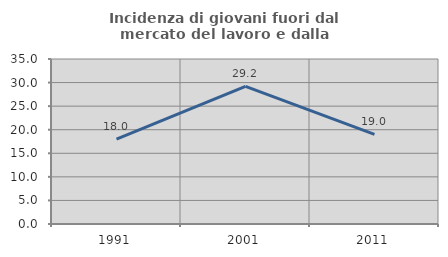
| Category | Incidenza di giovani fuori dal mercato del lavoro e dalla formazione  |
|---|---|
| 1991.0 | 17.985 |
| 2001.0 | 29.181 |
| 2011.0 | 19 |